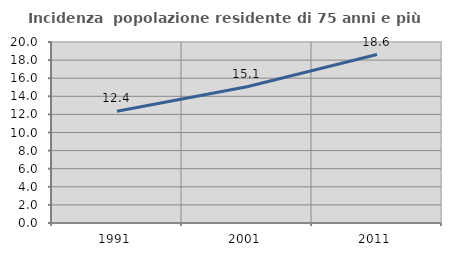
| Category | Incidenza  popolazione residente di 75 anni e più |
|---|---|
| 1991.0 | 12.353 |
| 2001.0 | 15.064 |
| 2011.0 | 18.614 |